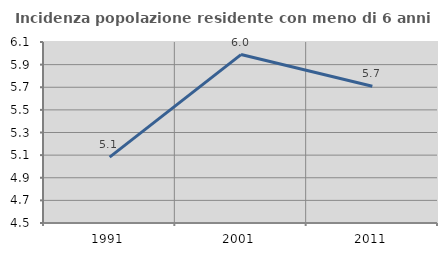
| Category | Incidenza popolazione residente con meno di 6 anni |
|---|---|
| 1991.0 | 5.082 |
| 2001.0 | 5.989 |
| 2011.0 | 5.709 |